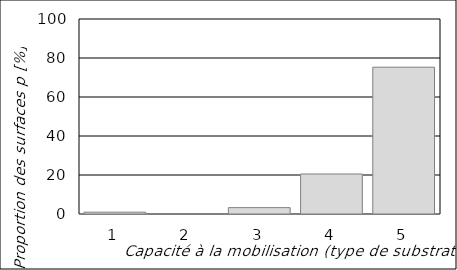
| Category | Series 1 |
|---|---|
| 0 | 0.934 |
| 1 | 0 |
| 2 | 3.269 |
| 3 | 20.51 |
| 4 | 75.287 |